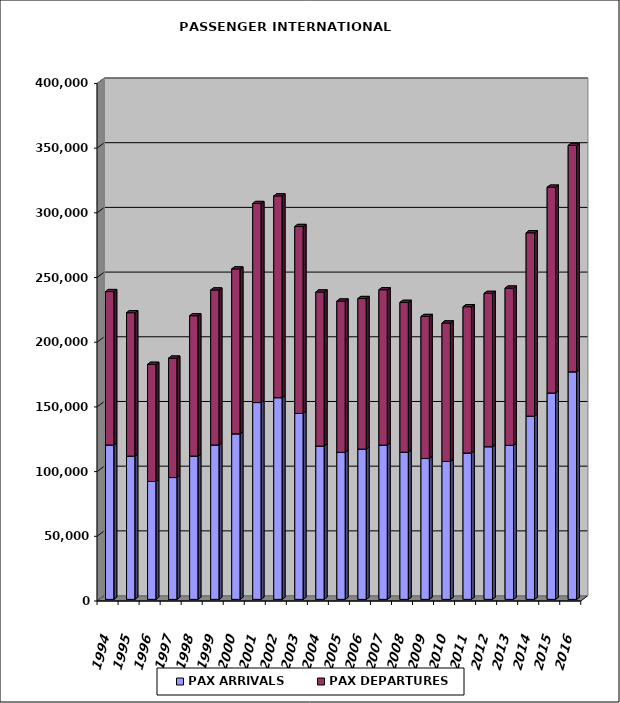
| Category | PAX ARRIVALS | PAX DEPARTURES |
|---|---|---|
| 1994.0 | 119301 | 118568 |
| 1995.0 | 110706 | 110849 |
| 1996.0 | 91119 | 90508 |
| 1997.0 | 94156 | 92276 |
| 1998.0 | 110723 | 108481 |
| 1999.0 | 119351 | 119745 |
| 2000.0 | 127962 | 127432 |
| 2001.0 | 152115 | 153813 |
| 2002.0 | 155897 | 155938 |
| 2003.0 | 143717 | 144456 |
| 2004.0 | 118431 | 119132 |
| 2005.0 | 113659 | 116890 |
| 2006.0 | 116136 | 116357 |
| 2007.0 | 119229 | 120058 |
| 2008.0 | 113740 | 115771 |
| 2009.0 | 108855 | 109746 |
| 2010.0 | 106619 | 106990 |
| 2011.0 | 113125 | 113060 |
| 2012.0 | 117989 | 118451 |
| 2013.0 | 119070 | 121487 |
| 2014.0 | 141609 | 141691 |
| 2015.0 | 159492 | 159031 |
| 2016.0 | 175866 | 174961 |